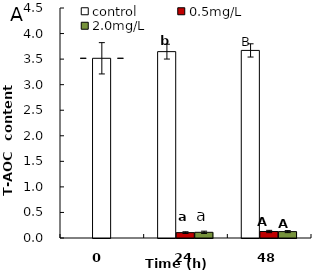
| Category | control | 0.5mg/L | 2.0mg/L |
|---|---|---|---|
| 0.0 | 3.516 | 3.516 | 3.516 |
| 24.0 | 3.646 | 0.105 | 0.111 |
| 48.0 | 3.67 | 0.127 | 0.125 |